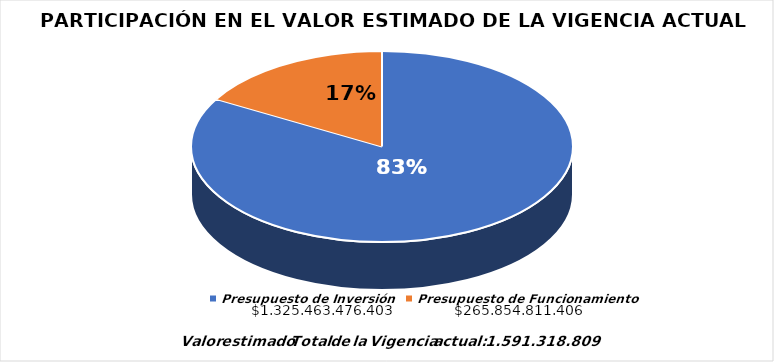
| Category | Series 0 |
|---|---|
| Presupuesto de Inversión | 0.833 |
| Presupuesto de Funcionamiento | 0.167 |